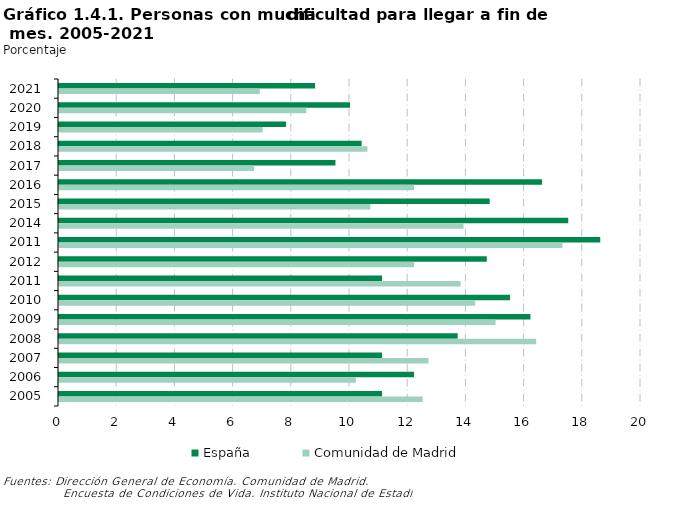
| Category | España | Comunidad de Madrid |
|---|---|---|
| 2021 | 8.8 | 6.9 |
| 2020 | 10 | 8.5 |
| 2019 | 7.8 | 7 |
| 2018 | 10.4 | 10.6 |
| 2017 | 9.5 | 6.7 |
| 2016 | 16.6 | 12.2 |
| 2015 | 14.8 | 10.7 |
| 2014 | 17.5 | 13.9 |
| 2011 | 18.6 | 17.3 |
| 2012 | 14.7 | 12.2 |
| 2011 | 11.1 | 13.8 |
| 2010 | 15.5 | 14.3 |
| 2009 | 16.2 | 15 |
| 2008 | 13.7 | 16.4 |
| 2007 | 11.1 | 12.7 |
| 2006 | 12.2 | 10.2 |
| 2005 | 11.1 | 12.5 |